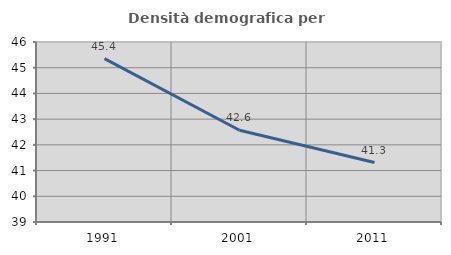
| Category | Densità demografica |
|---|---|
| 1991.0 | 45.352 |
| 2001.0 | 42.568 |
| 2011.0 | 41.311 |